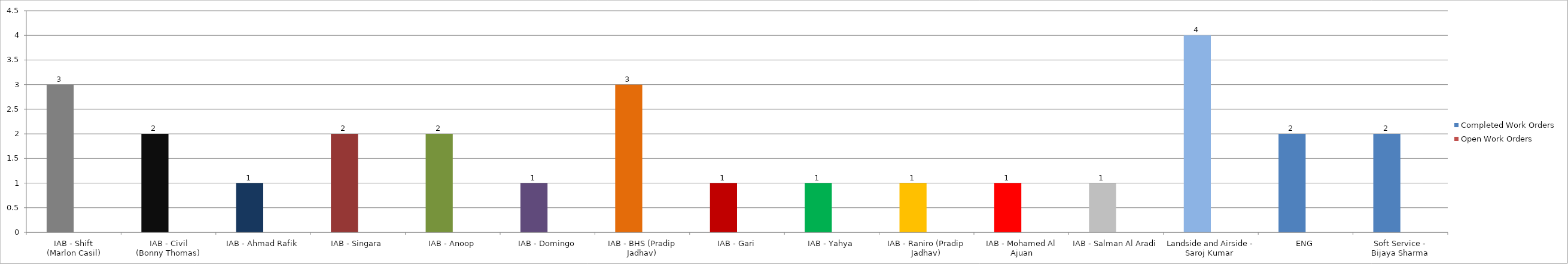
| Category | Completed Work Orders | Open Work Orders |
|---|---|---|
| IAB - Shift (Marlon Casil) | 3 | 0 |
| IAB - Civil (Bonny Thomas) | 2 | 0 |
| IAB - Ahmad Rafik | 1 | 0 |
| IAB - Singara | 2 | 0 |
| IAB - Anoop | 2 | 0 |
| IAB - Domingo | 1 | 0 |
| IAB - BHS (Pradip Jadhav) | 3 | 0 |
| IAB - Gari | 1 | 0 |
| IAB - Yahya | 1 | 0 |
| IAB - Raniro (Pradip Jadhav) | 1 | 0 |
| IAB - Mohamed Al Ajuan | 1 | 0 |
| IAB - Salman Al Aradi | 1 | 0 |
| Landside and Airside - Saroj Kumar  | 4 | 0 |
| ENG | 2 | 0 |
| Soft Service - Bijaya Sharma | 2 | 0 |